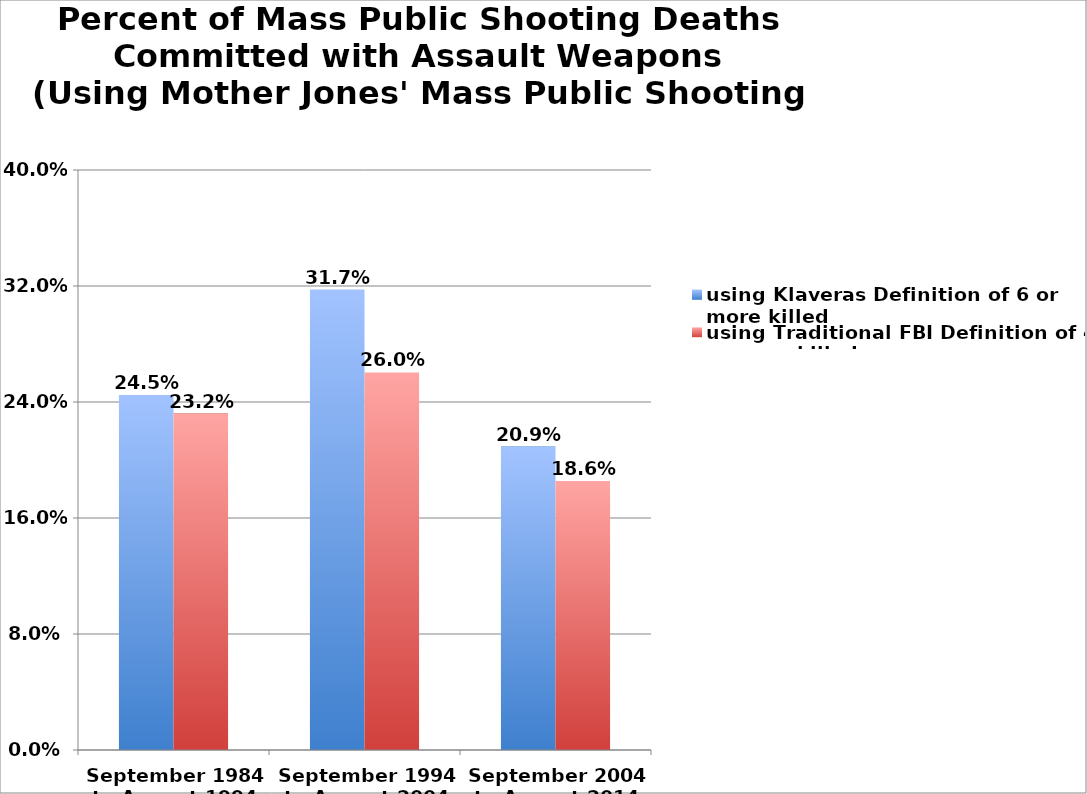
| Category | using Klaveras Definition of 6 or more killed | using Traditional FBI Definition of 4 or more killed |
|---|---|---|
| September 1984 to August 1994 | 0.245 | 0.232 |
| September 1994 to August 2004 | 0.317 | 0.26 |
| September 2004 to August 2014 | 0.209 | 0.186 |